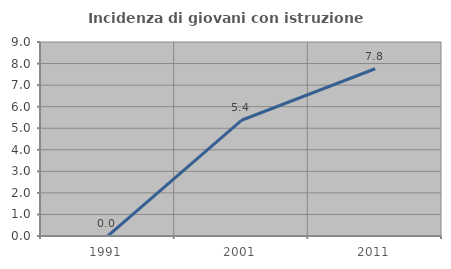
| Category | Incidenza di giovani con istruzione universitaria |
|---|---|
| 1991.0 | 0 |
| 2001.0 | 5.369 |
| 2011.0 | 7.759 |